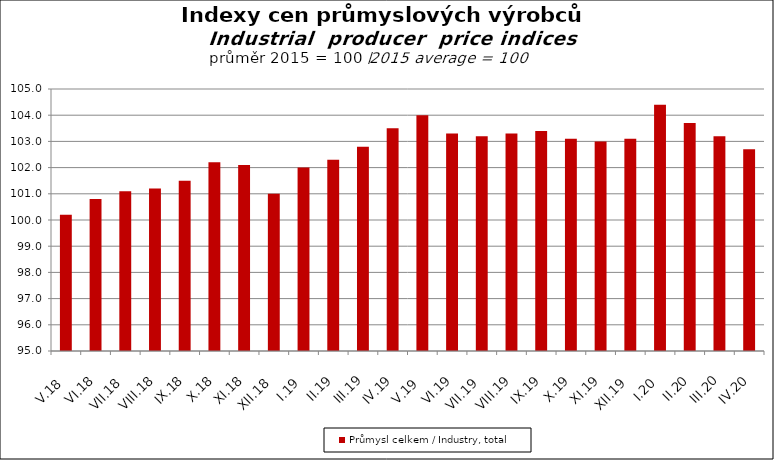
| Category | Průmysl celkem / Industry, total |
|---|---|
| V.18 | 100.2 |
| VI.18 | 100.8 |
| VII.18 | 101.1 |
| VIII.18 | 101.2 |
| IX.18 | 101.5 |
| X.18 | 102.2 |
| XI.18 | 102.1 |
| XII.18 | 101 |
| I.19 | 102 |
| II.19 | 102.3 |
| III.19 | 102.8 |
| IV.19 | 103.5 |
| V.19 | 104 |
| VI.19 | 103.3 |
| VII.19 | 103.2 |
| VIII.19 | 103.3 |
| IX.19 | 103.4 |
| X.19 | 103.1 |
| XI.19 | 103 |
| XII.19 | 103.1 |
| I.20 | 104.4 |
| II.20 | 103.7 |
| III.20 | 103.2 |
| IV.20 | 102.7 |